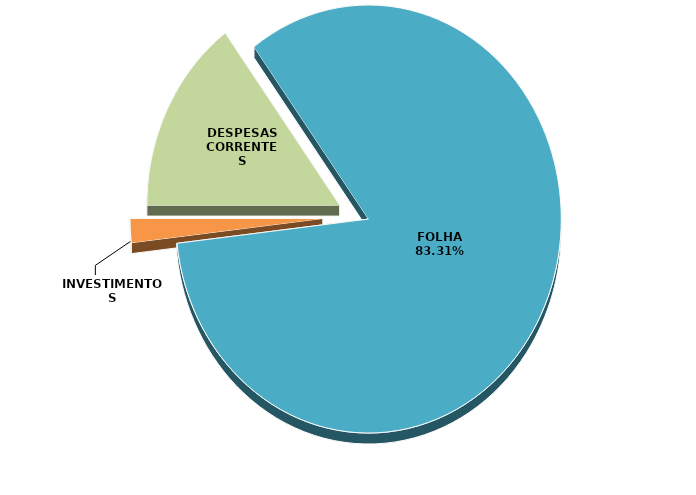
| Category | Series 0 | Series 1 |
|---|---|---|
| DESPESAS CORRENTES | 21229056.94 | 0.149 |
| FOLHA | 118834664.93 | 0.833 |
| INVESTIMENTOS | 2583330.98 | 0.018 |